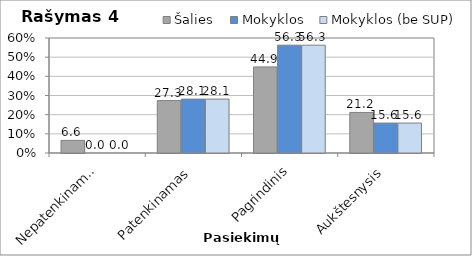
| Category | Šalies | Mokyklos | Mokyklos (be SUP) |
|---|---|---|---|
| Nepatenkinamas | 6.587 | 0 | 0 |
| Patenkinamas | 27.345 | 28.125 | 28.125 |
| Pagrindinis | 44.91 | 56.25 | 56.25 |
| Aukštesnysis | 21.158 | 15.625 | 15.625 |